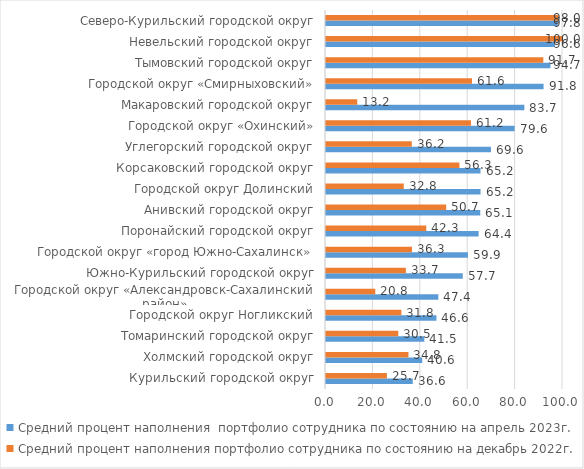
| Category | Средний процент наполнения  портфолио сотрудника по состоянию на апрель 2023г. | Средний процент наполнения портфолио сотрудника по состоянию на декабрь 2022г. |
|---|---|---|
| Курильский городской округ | 36.6 | 25.7 |
| Холмский городской округ | 40.6 | 34.8 |
| Томаринский городской округ | 41.5 | 30.5 |
| Городской округ Ногликский | 46.6 | 31.8 |
| Городской округ «Александровск-Сахалинский район» | 47.4 | 20.8 |
| Южно-Курильский городской округ | 57.7 | 33.7 |
| Городской округ «город Южно-Сахалинск» | 59.9 | 36.3 |
| Поронайский городской округ | 64.4 | 42.3 |
| Анивский городской округ | 65.1 | 50.7 |
| Городской округ Долинский | 65.2 | 32.8 |
| Корсаковский городской округ | 65.2 | 56.3 |
| Углегорский городской округ | 69.6 | 36.2 |
| Городской округ «Охинский» | 79.6 | 61.2 |
| Макаровский городской округ | 83.7 | 13.2 |
| Городской округ «Смирныховский» | 91.8 | 61.6 |
| Тымовский городской округ | 94.7 | 91.7 |
| Невельский городской округ | 96.6 | 100 |
| Северо-Курильский городской округ | 97.8 | 98 |